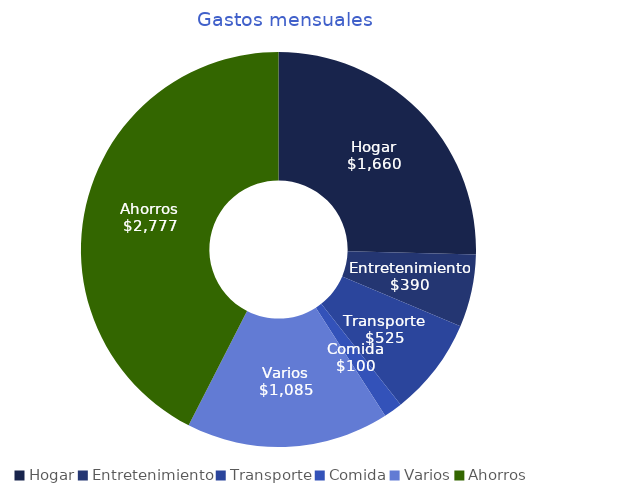
| Category | Series 0 |
|---|---|
| Hogar | 1660 |
| Entretenimiento | 390 |
| Transporte | 525 |
| Comida | 100 |
| Varios | 1085 |
| Ahorros | 2777 |